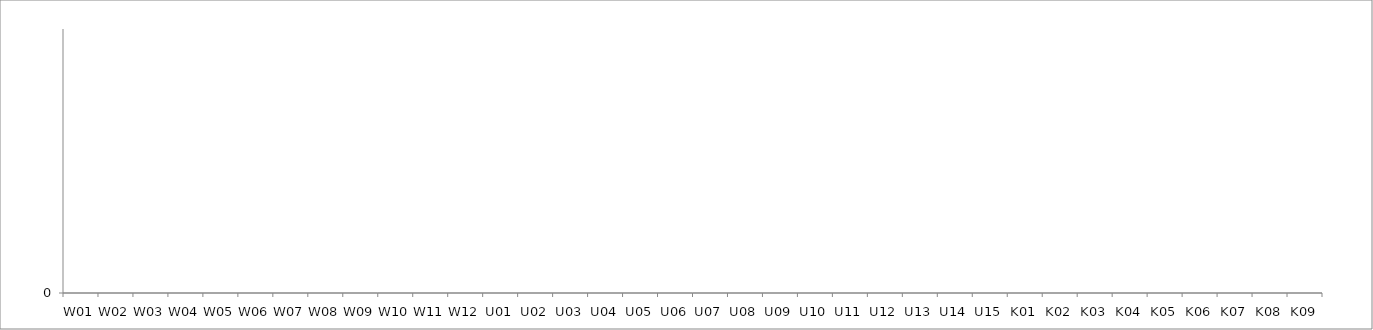
| Category | Series 0 |
|---|---|
| W01 | 0 |
| W02 | 0 |
| W03 | 0 |
| W04 | 0 |
| W05 | 0 |
| W06 | 0 |
| W07 | 0 |
| W08 | 0 |
| W09 | 0 |
| W10 | 0 |
| W11 | 0 |
| W12 | 0 |
| U01 | 0 |
| U02 | 0 |
| U03 | 0 |
| U04 | 0 |
| U05 | 0 |
| U06 | 0 |
| U07 | 0 |
| U08 | 0 |
| U09 | 0 |
| U10 | 0 |
| U11 | 0 |
| U12 | 0 |
| U13 | 0 |
| U14 | 0 |
| U15 | 0 |
| K01 | 0 |
| K02 | 0 |
| K03 | 0 |
| K04 | 0 |
| K05 | 0 |
| K06 | 0 |
| K07 | 0 |
| K08 | 0 |
| K09 | 0 |